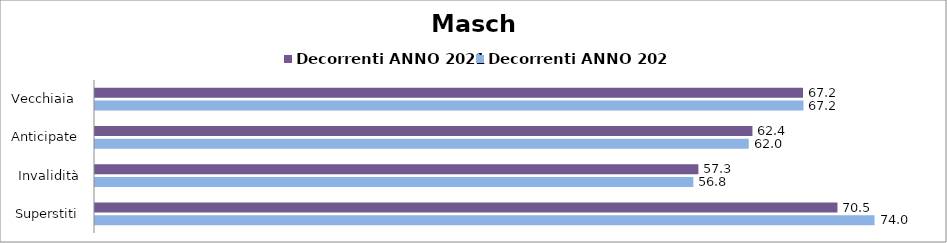
| Category | Decorrenti ANNO 2021 | Decorrenti ANNO 2022 |
|---|---|---|
| Vecchiaia  | 67.19 | 67.23 |
| Anticipate | 62.39 | 62.04 |
| Invalidità | 57.26 | 56.78 |
| Superstiti | 70.46 | 73.98 |